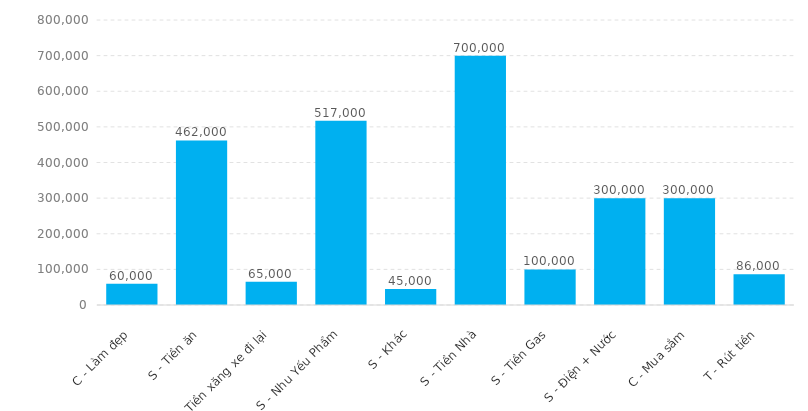
| Category | Total |
|---|---|
| C - Làm đẹp | 60000 |
| S - Tiền ăn | 462000 |
| S - Tiền xăng xe đi lại | 65000 |
| S - Nhu Yếu Phẩm | 517000 |
| S - Khác | 45000 |
| S - Tiền Nhà | 700000 |
| S - Tiền Gas | 100000 |
| S - Điện + Nước | 300000 |
| C - Mua sắm | 300000 |
| T - Rút tiền | 86000 |